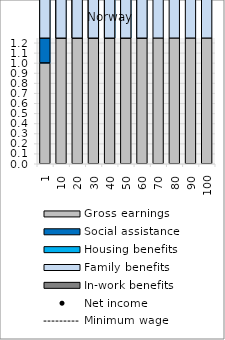
| Category | Gross earnings | Social assistance | Housing benefits | Family benefits | In-work benefits |
|---|---|---|---|---|---|
| 1.0 | 1 | 28.712 | 20.087 | 4.224 | 0 |
| 10.0 | 10 | 23.562 | 16.484 | 4.224 | 0 |
| 20.0 | 20 | 18.498 | 12.941 | 4.224 | 0 |
| 30.0 | 30 | 13.673 | 9.565 | 4.224 | 0 |
| 40.0 | 40 | 9.343 | 6.536 | 4.224 | 0 |
| 50.0 | 50 | 5.53 | 3.869 | 4.224 | 0 |
| 60.0 | 60 | 1.718 | 1.202 | 4.224 | 0 |
| 70.0 | 70 | 0 | 0 | 4.224 | 0 |
| 80.0 | 80 | 0 | 0 | 4.224 | 0 |
| 90.0 | 90 | 0 | 0 | 4.224 | 0 |
| 100.0 | 100 | 0 | 0 | 4.224 | 0 |